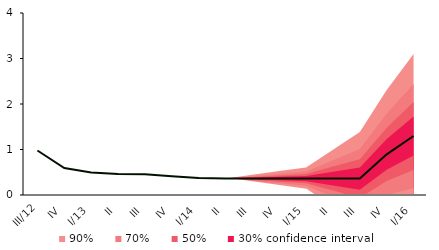
| Category | Centerline |
|---|---|
| III/12 | 0.979 |
| IV | 0.591 |
| I/13 | 0.496 |
| II | 0.463 |
| III | 0.458 |
| IV | 0.412 |
| I/14 | 0.372 |
| II | 0.363 |
| III | 0.361 |
| IV | 0.361 |
| I/15 | 0.361 |
| II | 0.361 |
| III | 0.361 |
| IV | 0.894 |
| I/16 | 1.298 |